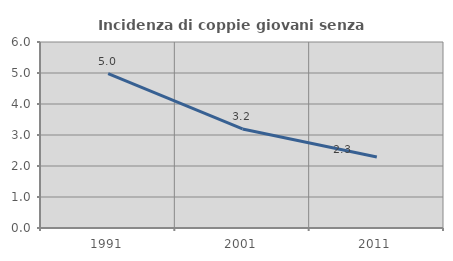
| Category | Incidenza di coppie giovani senza figli |
|---|---|
| 1991.0 | 4.977 |
| 2001.0 | 3.194 |
| 2011.0 | 2.292 |